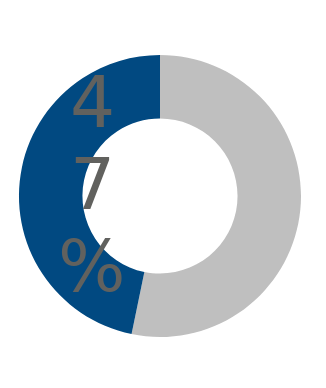
| Category | Series 0 |
|---|---|
| 0 | 0.532 |
| 1 | 0.468 |